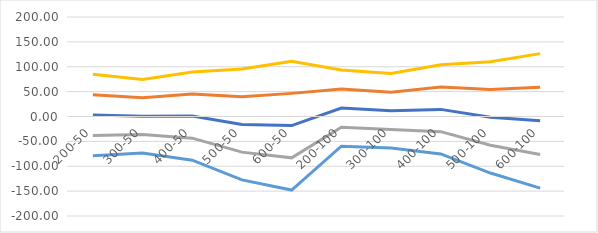
| Category | PhyMax | Plus | Minus | 2x+ | 2x- |
|---|---|---|---|---|---|
| 200-50 | 2.943 | 43.959 | -38.073 | 84.974 | -79.088 |
| 300-50 | 0.554 | 37.512 | -36.403 | 74.469 | -73.361 |
| 400-50 | 0.813 | 45.15 | -43.524 | 89.487 | -87.861 |
| 500-50 | -15.944 | 39.755 | -71.644 | 95.455 | -127.343 |
| 600-50 | -18.303 | 46.477 | -83.083 | 111.257 | -147.863 |
| 200-100 | 16.935 | 55.284 | -21.415 | 93.634 | -59.764 |
| 300-100 | 11.428 | 48.869 | -26.012 | 86.309 | -63.453 |
| 400-100 | 14.3 | 59.086 | -30.487 | 103.873 | -75.273 |
| 500-100 | -1.704 | 54.289 | -57.697 | 110.282 | -113.689 |
| 600-100 | -8.729 | 58.836 | -76.294 | 126.401 | -143.859 |